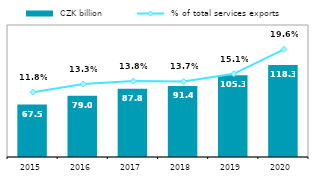
| Category |  CZK billion |
|---|---|
| 2015.0 | 67.463 |
| 2016.0 | 79.004 |
| 2017.0 | 87.808 |
| 2018.0 | 91.441 |
| 2019.0 | 105.286 |
| 2020.0 | 118.327 |